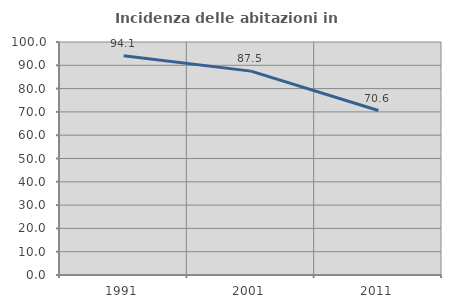
| Category | Incidenza delle abitazioni in proprietà  |
|---|---|
| 1991.0 | 94.118 |
| 2001.0 | 87.5 |
| 2011.0 | 70.588 |